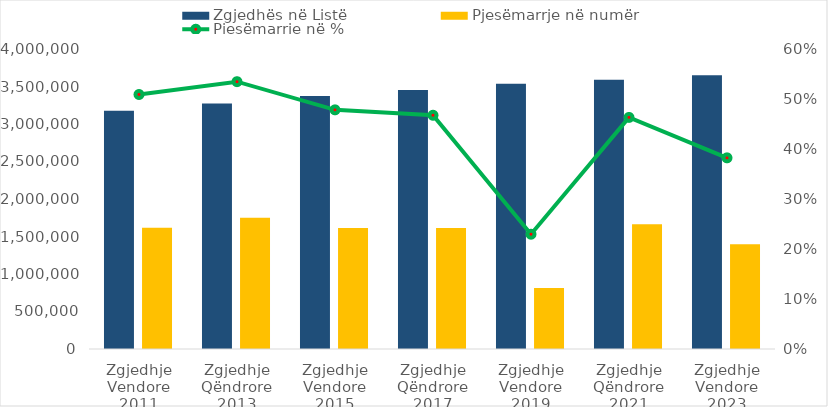
| Category | Zgjedhës në Listë | Pjesëmarrje në numër |
|---|---|---|
| Zgjedhje Vendore 2011 | 3178284 | 1617750 |
| Zgjedhje Qëndrore 2013 | 3271885 | 1749358 |
| Zgjedhje Vendore 2015 | 3372471 | 1613054 |
| Zgjedhje Qëndrore 2017 | 3452324 | 1613960 |
| Zgjedhje Vendore 2019 | 3536016 | 811727 |
| Zgjedhje Qëndrore 2021 | 3588869 | 1662274 |
| Zgjedhje Vendore 2023 | 3650658 | 1395645 |